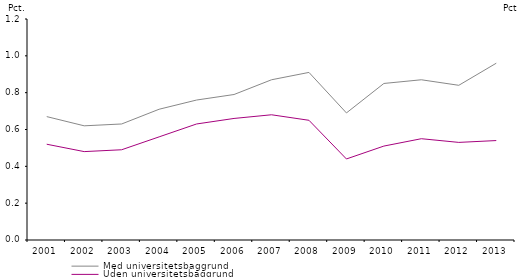
| Category | Med universitetsbaggrund | Uden universitetsbaggrund |
|---|---|---|
| 2001.0 | 0.67 | 0.52 |
| 2002.0 | 0.62 | 0.48 |
| 2003.0 | 0.63 | 0.49 |
| 2004.0 | 0.71 | 0.56 |
| 2005.0 | 0.76 | 0.63 |
| 2006.0 | 0.79 | 0.66 |
| 2007.0 | 0.87 | 0.68 |
| 2008.0 | 0.91 | 0.65 |
| 2009.0 | 0.69 | 0.44 |
| 2010.0 | 0.85 | 0.51 |
| 2011.0 | 0.87 | 0.55 |
| 2012.0 | 0.84 | 0.53 |
| 2013.0 | 0.96 | 0.54 |